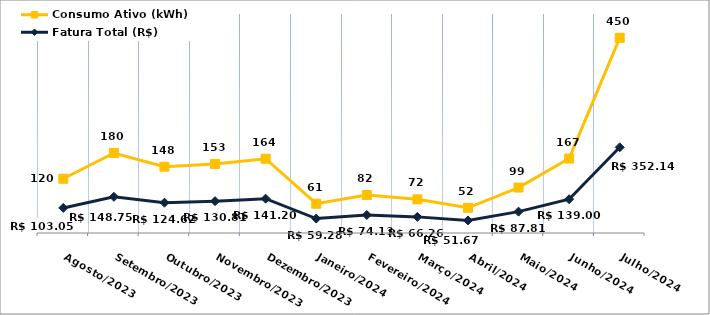
| Category | Fatura Total (R$) | Consumo Ativo (kWh) |
|---|---|---|
| Agosto/2023 | 103.05 | 120 |
| Setembro/2023 | 148.75 | 180 |
| Outubro/2023 | 124.62 | 148 |
| Novembro/2023 | 130.81 | 153 |
| Dezembro/2023 | 141.2 | 164 |
| Janeiro/2024 | 59.28 | 61 |
| Fevereiro/2024 | 74.13 | 82 |
| Março/2024 | 66.26 | 72 |
| Abril/2024 | 51.67 | 52 |
| Maio/2024 | 87.81 | 99 |
| Junho/2024 | 139 | 167 |
| Julho/2024 | 352.14 | 450 |